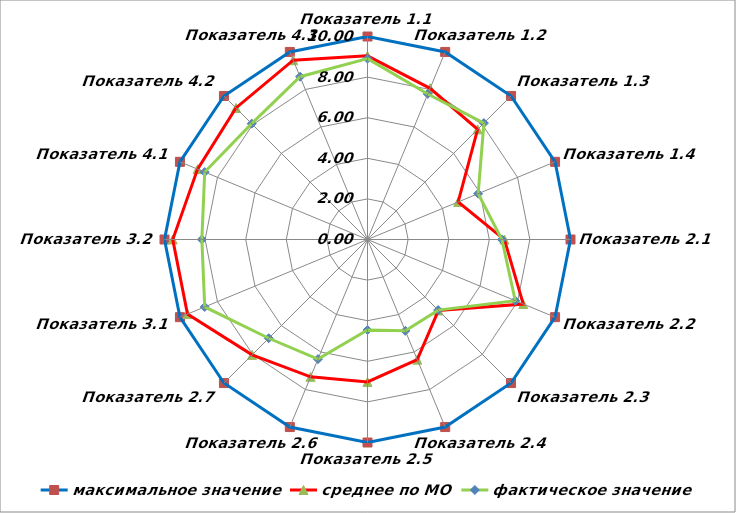
| Category | максимальное значение | среднее по МО | фактическое значение |
|---|---|---|---|
| Показатель 1.1 | 10 | 9.046 | 8.91 |
| Показатель 1.2 | 10 | 8.061 | 7.76 |
| Показатель 1.3 | 10 | 7.673 | 8.11 |
| Показатель 1.4 | 10 | 4.833 | 5.9 |
| Показатель 2.1 | 10 | 6.745 | 6.62 |
| Показатель 2.2 | 10 | 8.305 | 7.88 |
| Показатель 2.3 | 10 | 4.943 | 4.92 |
| Показатель 2.4 | 10 | 6.405 | 4.87 |
| Показатель 2.5 | 10 | 7.017 | 4.46 |
| Показатель 2.6 | 10 | 7.323 | 6.38 |
| Показатель 2.7 | 10 | 8.039 | 6.88 |
| Показатель 3.1 | 10 | 9.599 | 8.68 |
| Показатель 3.2 | 10 | 9.593 | 8.16 |
| Показатель 4.1 | 10 | 9.059 | 8.68 |
| Показатель 4.2 | 10 | 9.164 | 8.07 |
| Показатель 4.3 | 10 | 9.561 | 8.68 |